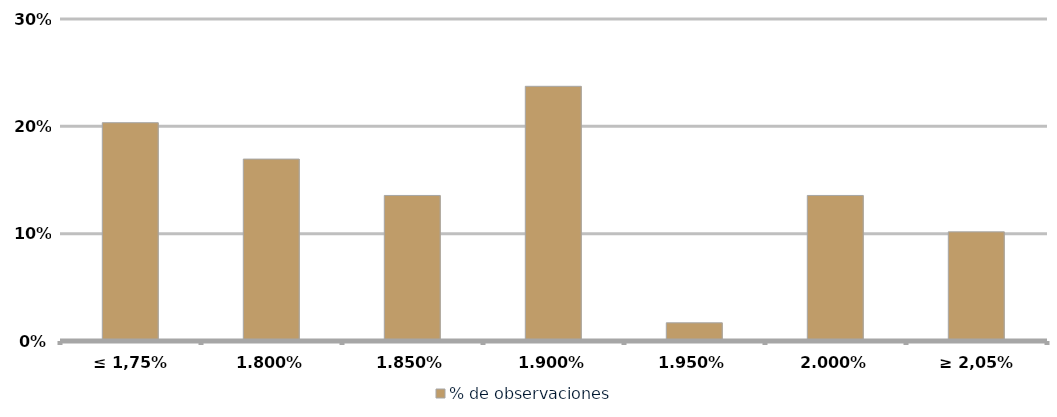
| Category | % de observaciones  |
|---|---|
| ≤ 1,75% | 0.203 |
| 1,80% | 0.169 |
| 1,85% | 0.136 |
| 1,90% | 0.237 |
| 1,95% | 0.017 |
| 2,00% | 0.136 |
| ≥ 2,05% | 0.102 |